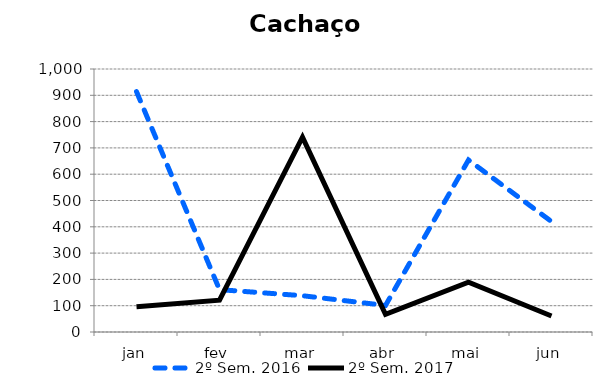
| Category | 2º Sem. 2016 | 2º Sem. 2017 |
|---|---|---|
| jan | 914 | 96 |
| fev | 161 | 121 |
| mar | 138 | 741 |
| abr | 101 | 67 |
| mai | 654 | 189 |
| jun | 420 | 61 |